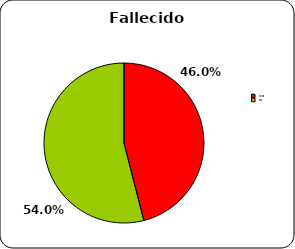
| Category | Fallecido |
|---|---|
| No | 46 |
| Si | 54 |